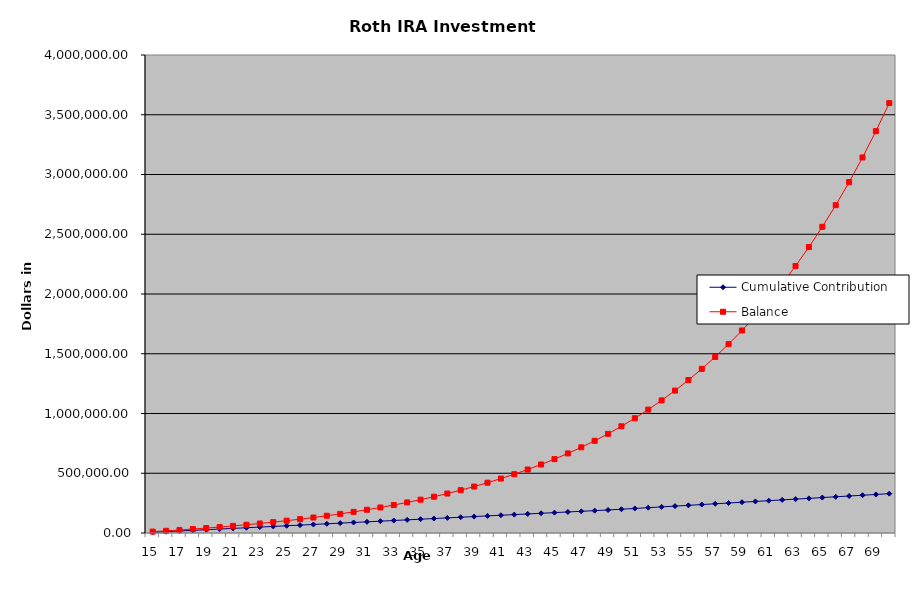
| Category | Cumulative | Balance |
|---|---|---|
| 15.0 | 5500 | 11746.46 |
| 16.0 | 11000 | 18416.805 |
| 17.0 | 16500 | 25539.799 |
| 18.0 | 22000 | 33146.16 |
| 19.0 | 27500 | 41268.688 |
| 20.0 | 33000 | 49942.412 |
| 21.0 | 38500 | 59204.734 |
| 22.0 | 44000 | 69095.597 |
| 23.0 | 49500 | 79657.654 |
| 24.0 | 55000 | 90936.452 |
| 25.0 | 60500 | 102980.63 |
| 26.0 | 66000 | 115842.126 |
| 27.0 | 71500 | 129576.402 |
| 28.0 | 77000 | 144242.687 |
| 29.0 | 82500 | 159904.226 |
| 30.0 | 88000 | 176628.556 |
| 31.0 | 93500 | 194487.8 |
| 32.0 | 99000 | 213558.972 |
| 33.0 | 104500 | 233924.314 |
| 34.0 | 110000 | 255671.648 |
| 35.0 | 115500 | 278894.756 |
| 36.0 | 121000 | 303693.784 |
| 37.0 | 126500 | 330175.675 |
| 38.0 | 132000 | 358454.626 |
| 39.0 | 137500 | 388652.587 |
| 40.0 | 143000 | 420899.781 |
| 41.0 | 148500 | 455335.27 |
| 42.0 | 154000 | 492107.552 |
| 43.0 | 159500 | 531375.2 |
| 44.0 | 165000 | 573307.551 |
| 45.0 | 170500 | 618085.432 |
| 46.0 | 176000 | 665901.939 |
| 47.0 | 181500 | 716963.275 |
| 48.0 | 187000 | 771489.633 |
| 49.0 | 192500 | 829716.149 |
| 50.0 | 199000 | 892961.777 |
| 51.0 | 205500 | 960499.253 |
| 52.0 | 212000 | 1032619.823 |
| 53.0 | 218500 | 1109634.494 |
| 54.0 | 225000 | 1191875.381 |
| 55.0 | 231500 | 1279697.134 |
| 56.0 | 238000 | 1373478.471 |
| 57.0 | 244500 | 1473623.81 |
| 58.0 | 251000 | 1580565.012 |
| 59.0 | 257500 | 1694763.244 |
| 60.0 | 264000 | 1816710.968 |
| 61.0 | 270500 | 1946934.064 |
| 62.0 | 277000 | 2085994.1 |
| 63.0 | 283500 | 2234490.749 |
| 64.0 | 290000 | 2393064.381 |
| 65.0 | 296500 | 2562398.82 |
| 66.0 | 303000 | 2743224.294 |
| 67.0 | 309500 | 2936320.585 |
| 68.0 | 316000 | 3142520.39 |
| 69.0 | 322500 | 3362712.913 |
| 70.0 | 329000 | 3597847.702 |